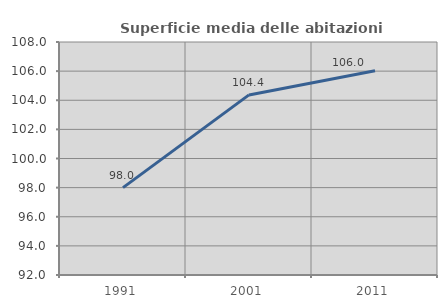
| Category | Superficie media delle abitazioni occupate |
|---|---|
| 1991.0 | 97.997 |
| 2001.0 | 104.367 |
| 2011.0 | 106.031 |